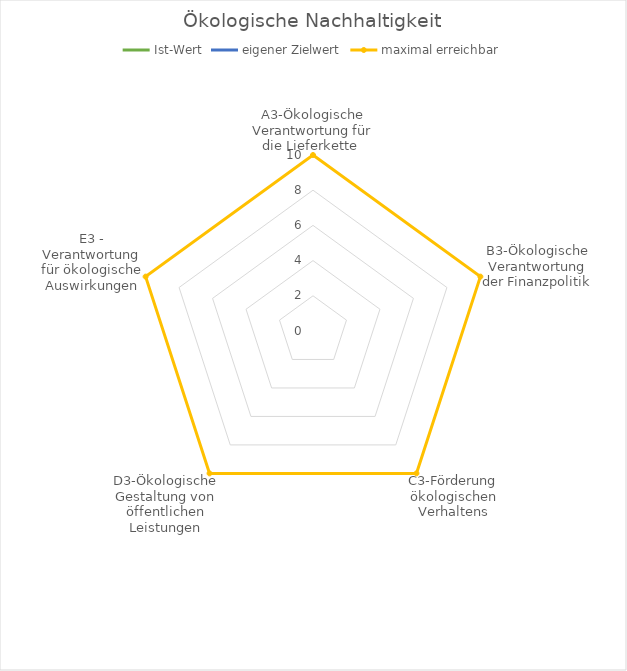
| Category | Ist-Wert | eigener Zielwert | maximal erreichbar |
|---|---|---|---|
| A3-Ökologische Verantwortung für die Lieferkette  | 0 | 0 | 10 |
| B3-Ökologische Verantwortung der Finanzpolitik | 0 | 0 | 10 |
| C3-Förderung ökologischen Verhaltens | 0 | 0 | 10 |
| D3-Ökologische Gestaltung von öffentlichen Leistungen | 0 | 0 | 10 |
| E3 - Verantwortung für ökologische Auswirkungen | 0 | 0 | 10 |